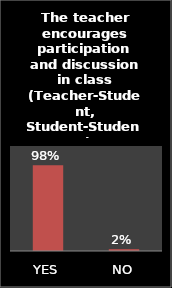
| Category | Series 0 |
|---|---|
| YES | 0.979 |
| NO | 0.021 |